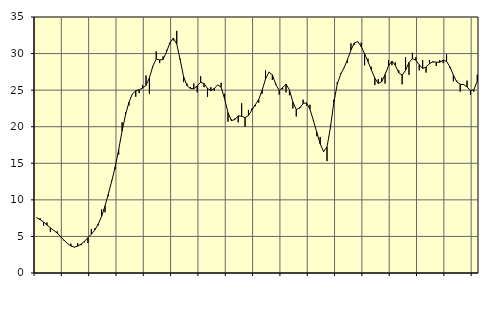
| Category | Piggar | Series 1 |
|---|---|---|
| nan | 7.6 | 7.55 |
| 87.0 | 7.5 | 7.29 |
| 87.0 | 6.5 | 6.97 |
| 87.0 | 6.9 | 6.56 |
| nan | 5.6 | 6.17 |
| 88.0 | 5.8 | 5.82 |
| 88.0 | 5.7 | 5.46 |
| 88.0 | 4.9 | 4.99 |
| nan | 4.4 | 4.48 |
| 89.0 | 4 | 4.05 |
| 89.0 | 4 | 3.69 |
| 89.0 | 3.5 | 3.54 |
| nan | 4.1 | 3.67 |
| 90.0 | 3.8 | 3.96 |
| 90.0 | 4.2 | 4.33 |
| 90.0 | 4.1 | 4.82 |
| nan | 6 | 5.31 |
| 91.0 | 6.1 | 5.87 |
| 91.0 | 6.5 | 6.68 |
| 91.0 | 8.7 | 7.75 |
| nan | 8.3 | 9.17 |
| 92.0 | 10.5 | 10.85 |
| 92.0 | 12.7 | 12.63 |
| 92.0 | 14.2 | 14.54 |
| nan | 16.2 | 16.88 |
| 93.0 | 20.6 | 19.41 |
| 93.0 | 22 | 21.63 |
| 93.0 | 22.9 | 23.33 |
| nan | 24.5 | 24.47 |
| 94.0 | 24.1 | 24.91 |
| 94.0 | 24.6 | 25.06 |
| 94.0 | 25.7 | 25.28 |
| nan | 27 | 25.64 |
| 95.0 | 24.5 | 26.69 |
| 95.0 | 28.2 | 28.27 |
| 95.0 | 30.3 | 29.26 |
| nan | 28.7 | 29.14 |
| 96.0 | 29.6 | 29.19 |
| 96.0 | 30.5 | 30.22 |
| 96.0 | 31.3 | 31.48 |
| nan | 31.8 | 32.11 |
| 97.0 | 33.1 | 31.3 |
| 97.0 | 29.3 | 29.16 |
| 97.0 | 26.1 | 26.86 |
| nan | 25.9 | 25.61 |
| 98.0 | 25.4 | 25.23 |
| 98.0 | 25.9 | 25.19 |
| 98.0 | 24.7 | 25.59 |
| nan | 26.9 | 26.06 |
| 99.0 | 25.4 | 25.9 |
| 99.0 | 24.1 | 25.23 |
| 99.0 | 25.4 | 24.93 |
| nan | 24.9 | 25.25 |
| 0.0 | 25.7 | 25.71 |
| 0.0 | 26 | 25.4 |
| 0.0 | 24.5 | 23.83 |
| nan | 20.7 | 21.93 |
| 1.0 | 21 | 20.83 |
| 1.0 | 21.1 | 20.98 |
| 1.0 | 20.6 | 21.48 |
| nan | 23.2 | 21.42 |
| 2.0 | 20 | 21.23 |
| 2.0 | 22.3 | 21.54 |
| 2.0 | 22.5 | 22.28 |
| nan | 22.8 | 23 |
| 3.0 | 23.3 | 23.71 |
| 3.0 | 24.5 | 24.96 |
| 3.0 | 27.7 | 26.53 |
| nan | 27.5 | 27.45 |
| 4.0 | 26.4 | 27.1 |
| 4.0 | 25.9 | 25.78 |
| 4.0 | 24.4 | 24.94 |
| nan | 25.1 | 25.34 |
| 5.0 | 24.7 | 25.82 |
| 5.0 | 24.3 | 25.04 |
| 5.0 | 22.5 | 23.37 |
| nan | 21.4 | 22.35 |
| 6.0 | 22.7 | 22.55 |
| 6.0 | 23.7 | 23.16 |
| 6.0 | 22.9 | 23.27 |
| nan | 23 | 22.4 |
| 7.0 | 20.8 | 20.88 |
| 7.0 | 18.7 | 19.24 |
| 7.0 | 18.6 | 17.64 |
| nan | 16.7 | 16.61 |
| 8.0 | 15.3 | 17.23 |
| 8.0 | 20.2 | 19.89 |
| 8.0 | 23.7 | 23.33 |
| nan | 26.1 | 25.82 |
| 9.0 | 27.3 | 27.18 |
| 9.0 | 28.1 | 28.06 |
| 9.0 | 28.7 | 29.19 |
| nan | 31.4 | 30.48 |
| 10.0 | 31.2 | 31.45 |
| 10.0 | 31.6 | 31.64 |
| 10.0 | 31.5 | 30.96 |
| nan | 28.4 | 29.98 |
| 11.0 | 29.3 | 28.91 |
| 11.0 | 28.2 | 27.76 |
| 11.0 | 25.7 | 26.63 |
| nan | 26.5 | 25.92 |
| 12.0 | 26.7 | 26.15 |
| 12.0 | 25.9 | 27.13 |
| 12.0 | 29.1 | 28.3 |
| nan | 28.4 | 28.97 |
| 13.0 | 28.8 | 28.4 |
| 13.0 | 27.7 | 27.38 |
| 13.0 | 25.8 | 27.05 |
| nan | 29.5 | 27.71 |
| 14.0 | 27.1 | 28.79 |
| 14.0 | 30.1 | 29.29 |
| 14.0 | 29.5 | 29.1 |
| nan | 27.7 | 28.47 |
| 15.0 | 29.1 | 27.97 |
| 15.0 | 27.4 | 28.15 |
| 15.0 | 29.1 | 28.61 |
| nan | 28.8 | 28.89 |
| 16.0 | 28.3 | 28.82 |
| 16.0 | 29.1 | 28.81 |
| 16.0 | 28.7 | 29.09 |
| nan | 29.9 | 28.94 |
| 17.0 | 28 | 28.16 |
| 17.0 | 26.2 | 27.07 |
| 17.0 | 26.3 | 26.12 |
| nan | 24.8 | 25.81 |
| 18.0 | 25.8 | 25.76 |
| 18.0 | 26.3 | 25.44 |
| 18.0 | 24.4 | 24.92 |
| nan | 24.8 | 25.06 |
| 19.0 | 27.1 | 26.26 |